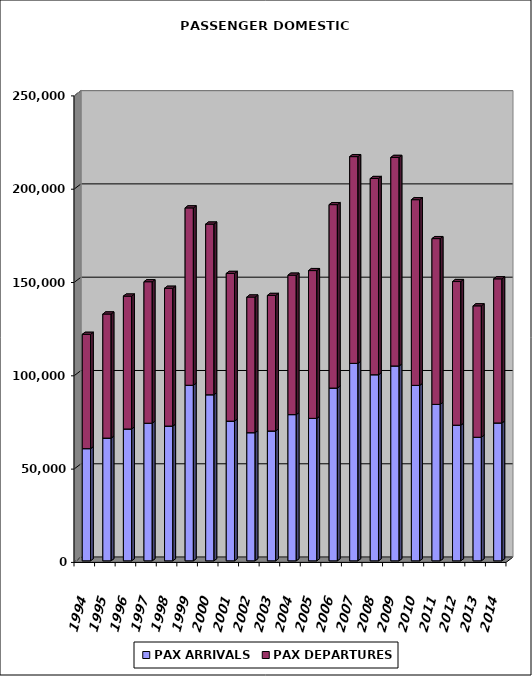
| Category | PAX ARRIVALS | PAX DEPARTURES |
|---|---|---|
| 1994.0 | 60122 | 61248 |
| 1995.0 | 65769 | 66500 |
| 1996.0 | 70656 | 71208 |
| 1997.0 | 73734 | 75830 |
| 1998.0 | 72216 | 73840 |
| 1999.0 | 94085 | 95047 |
| 2000.0 | 88999 | 91447 |
| 2001.0 | 74864 | 79140 |
| 2002.0 | 68674 | 72688 |
| 2003.0 | 69584 | 72628 |
| 2004.0 | 78360 | 74707 |
| 2005.0 | 76355 | 79179 |
| 2006.0 | 92586 | 98293 |
| 2007.0 | 105823 | 110782 |
| 2008.0 | 99732 | 105141 |
| 2009.0 | 104440 | 111734 |
| 2010.0 | 94025 | 99505 |
| 2011.0 | 83834 | 88838 |
| 2012.0 | 72686 | 76978 |
| 2013.0 | 66230 | 70411 |
| 2014.0 | 73886 | 77221 |